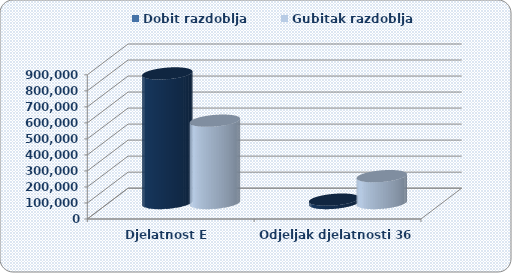
| Category | Dobit razdoblja  | Gubitak razdoblja  |
|---|---|---|
| Djelatnost E  | 808814.119 | 513778.232 |
| Odjeljak djelatnosti 36 | 20841.295 | 167551.11 |